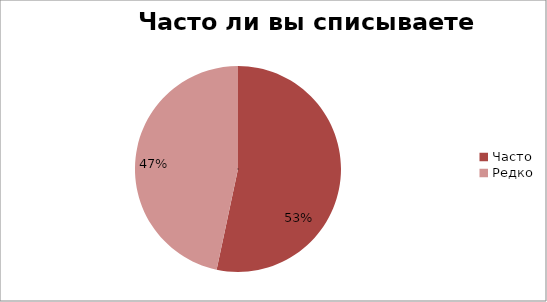
| Category | Series 0 |
|---|---|
| Часто  | 8 |
| Редко | 7 |